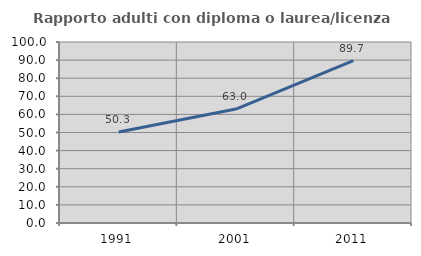
| Category | Rapporto adulti con diploma o laurea/licenza media  |
|---|---|
| 1991.0 | 50.313 |
| 2001.0 | 62.976 |
| 2011.0 | 89.735 |